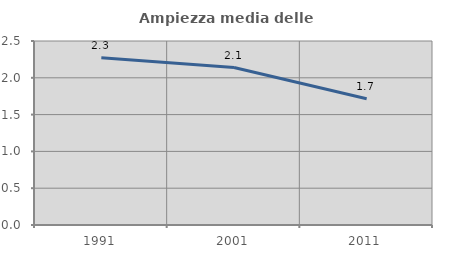
| Category | Ampiezza media delle famiglie |
|---|---|
| 1991.0 | 2.273 |
| 2001.0 | 2.14 |
| 2011.0 | 1.714 |